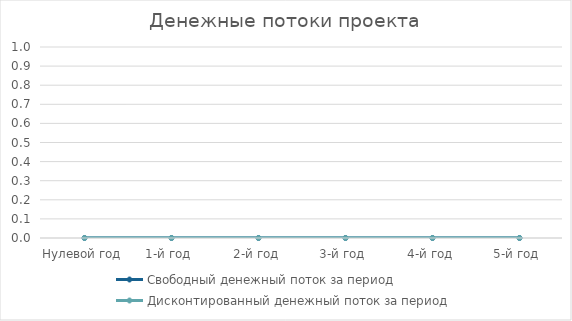
| Category | Свободный денежный поток за период | Дисконтированный денежный поток за период |
|---|---|---|
| Нулевой год | 0 | 0 |
| 1-й год | 0 | 0 |
| 2-й год | 0 | 0 |
| 3-й год | 0 | 0 |
| 4-й год | 0 | 0 |
| 5-й год | 0 | 0 |